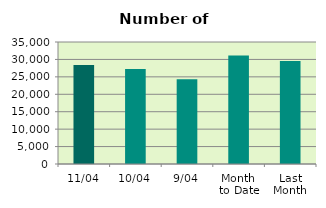
| Category | Series 0 |
|---|---|
| 11/04 | 28426 |
| 10/04 | 27230 |
| 9/04 | 24316 |
| Month 
to Date | 31114 |
| Last
Month | 29553.143 |